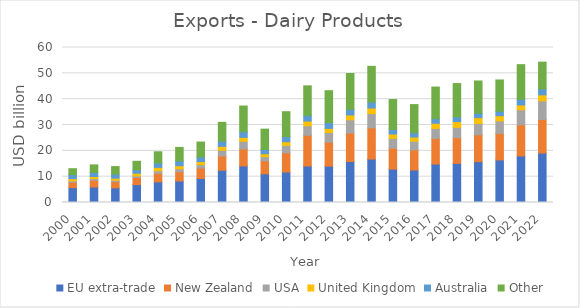
| Category | EU extra-trade | New Zealand | USA | United Kingdom | Australia | Other |
|---|---|---|---|---|---|---|
| 2000.0 | 5737.463 | 2080.338 | 537.357 | 879.159 | 1550.288 | 2296.808 |
| 2001.0 | 5988.685 | 2664.229 | 621.897 | 781.924 | 1555.839 | 2958.368 |
| 2002.0 | 5674.706 | 2400.404 | 529.785 | 812.104 | 1548.645 | 2945.517 |
| 2003.0 | 6925.511 | 2749.869 | 592.785 | 1074.935 | 1321.979 | 3283.991 |
| 2004.0 | 7988.151 | 3292.149 | 984.785 | 1330.411 | 1710.855 | 4324.59 |
| 2005.0 | 8310.749 | 3634.712 | 1106.87 | 1184.604 | 1823.291 | 5269.462 |
| 2006.0 | 9323.646 | 4019.909 | 1291.545 | 1195.62 | 1790.743 | 5779.486 |
| 2007.0 | 12487.64 | 5522.132 | 2216.986 | 1493.271 | 2014.331 | 7292.214 |
| 2008.0 | 14155.065 | 6562.974 | 2994.458 | 1497.435 | 2207.709 | 9928.355 |
| 2009.0 | 11094.027 | 5037.705 | 1600.285 | 1141.565 | 1649.363 | 7869.879 |
| 2010.0 | 11813.86 | 7432.575 | 2851.235 | 1436.424 | 1959.874 | 9662.781 |
| 2011.0 | 14126.69 | 11900.571 | 3687.732 | 1786.2 | 2211.995 | 11440.001 |
| 2012.0 | 14079.191 | 9251.581 | 3747.552 | 1610.408 | 2215.276 | 12366.359 |
| 2013.0 | 15867.183 | 11007.238 | 5139.637 | 1870.39 | 2201.866 | 13847.018 |
| 2014.0 | 16820.814 | 12061.497 | 5541.951 | 2150.634 | 2288.204 | 13847.44 |
| 2015.0 | 12935.828 | 8083.401 | 3817.048 | 1673.909 | 1781.632 | 11561.29 |
| 2016.0 | 12571.969 | 7787.999 | 3359.084 | 1632.948 | 1628.38 | 10926.199 |
| 2017.0 | 14870.414 | 9917.711 | 3880.785 | 2006.873 | 1765.052 | 12244.564 |
| 2018.0 | 15155.66 | 9925.949 | 3997.975 | 2231.803 | 1810.435 | 12920.131 |
| 2019.0 | 15824.38 | 10411.547 | 4370.799 | 2248.056 | 1700.262 | 12484.366 |
| 2020.0 | 16471.548 | 10268.592 | 4844.368 | 2014.555 | 1720.964 | 12105.734 |
| 2021.0 | 18021.292 | 12052.553 | 5815.713 | 1872.851 | 2192.597 | 13413.488 |
| 2022.0 | 19139.831 | 12969.075 | 7224.627 | 2328.148 | 2306.694 | 10359.348 |